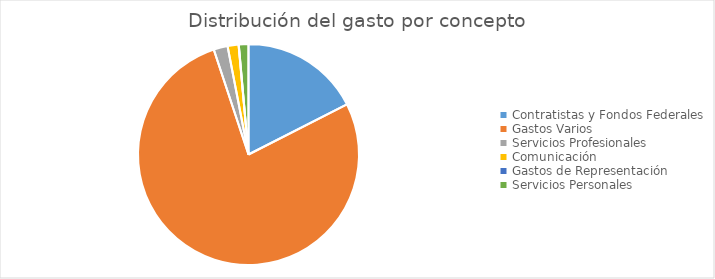
| Category | Series 0 |
|---|---|
| Contratistas y Fondos Federales | 108247268.33 |
| Gastos Varios | 479078888.19 |
| Servicios Profesionales | 12650506.24 |
| Comunicación | 9918491.41 |
| Gastos de Representación | 192799.53 |
| Servicios Personales | 8714559.34 |